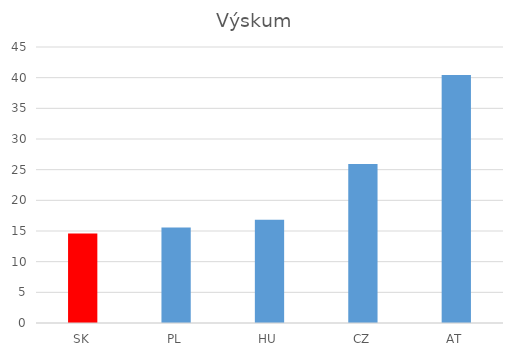
| Category | Výskum |
|---|---|
| SK | 14.6 |
| PL | 15.567 |
| HU | 16.833 |
| CZ | 25.933 |
| AT | 40.433 |